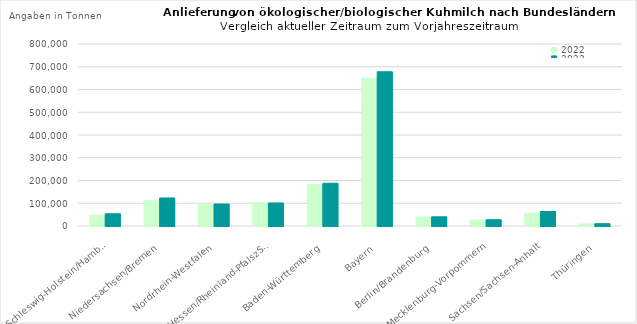
| Category | 2022 | 2023 |
|---|---|---|
| Schleswig-Holstein/Hamburg | 46261.259 | 53689.805 |
| Niedersachsen/Bremen | 110933.867 | 123259.79 |
| Nordrhein-Westfalen | 97005.498 | 96597.178 |
| Hessen/Rheinland-PfalszSaarland | 102115.868 | 101177.884 |
| Baden-Württemberg | 182461.073 | 187842.451 |
| Bayern | 649692.091 | 678002.292 |
| Berlin/Brandenburg | 39111.53 | 40389.875 |
| Mecklenburg-Vorpommern | 25901.144 | 27558.858 |
| Sachsen/Sachsen-Anhalt | 54802.418 | 63496.627 |
| Thüringen | 9410.671 | 10217.608 |